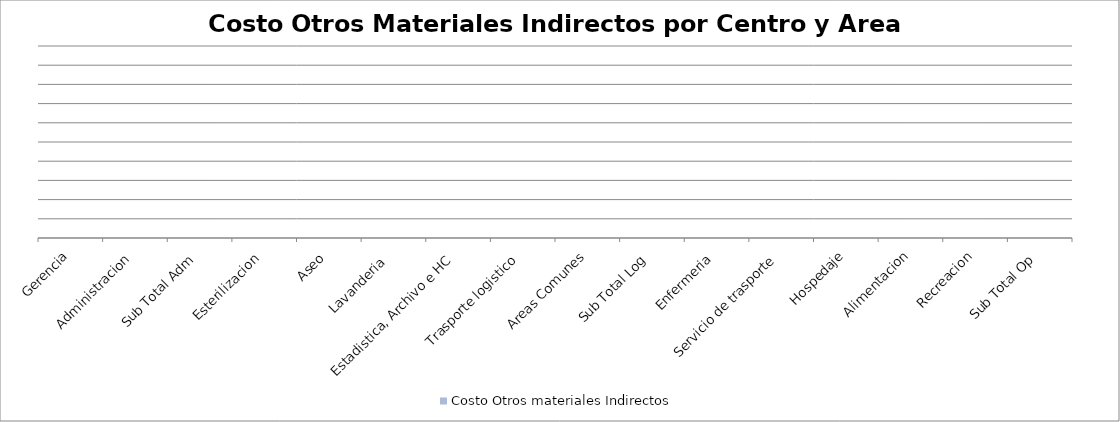
| Category | Costo Otros materiales Indirectos |
|---|---|
| Gerencia | 0 |
| Administracion | 0 |
| Sub Total Adm | 0 |
| Esterilizacion  | 0 |
| Aseo | 0 |
| Lavanderia  | 0 |
| Estadistica, Archivo e HC | 0 |
| Trasporte logistico  | 0 |
| Areas Comunes | 0 |
| Sub Total Log | 0 |
| Enfermeria | 0 |
| Servicio de trasporte | 0 |
| Hospedaje | 0 |
| Alimentacion | 0 |
| Recreacion | 0 |
| Sub Total Op | 0 |